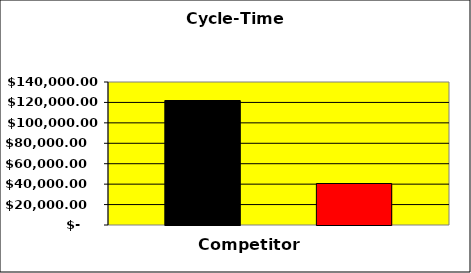
| Category | Series 0 | Series 1 | Series 2 |
|---|---|---|---|
| 0 | 121875 |  | 40625 |